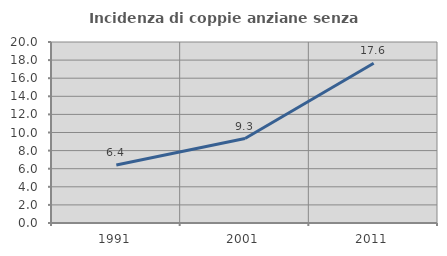
| Category | Incidenza di coppie anziane senza figli  |
|---|---|
| 1991.0 | 6.41 |
| 2001.0 | 9.333 |
| 2011.0 | 17.647 |